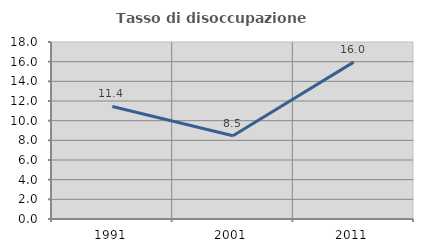
| Category | Tasso di disoccupazione giovanile  |
|---|---|
| 1991.0 | 11.443 |
| 2001.0 | 8.462 |
| 2011.0 | 15.954 |